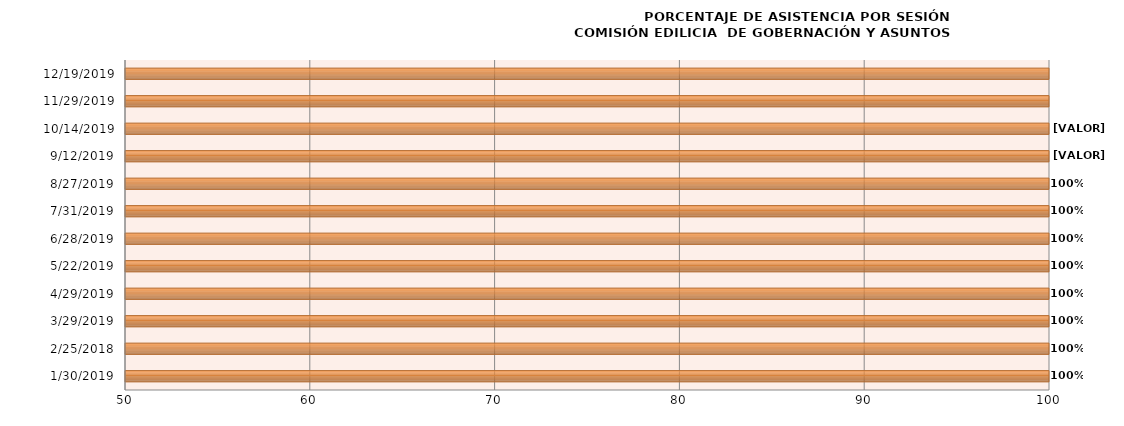
| Category | Series 0 |
|---|---|
| 1/30/19 | 100 |
| 2/25/18 | 100 |
| 3/29/19 | 100 |
| 4/29/19 | 100 |
| 5/22/19 | 100 |
| 6/28/19 | 100 |
| 7/31/19 | 100 |
| 8/27/19 | 100 |
| 9/12/19 | 100 |
| 10/14/19 | 100 |
| 11/29/19 | 100 |
| 12/19/19 | 100 |